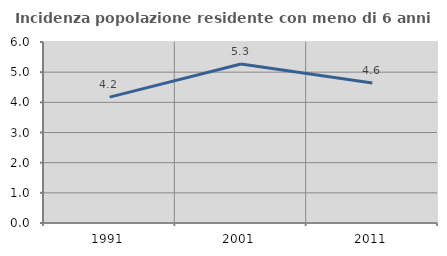
| Category | Incidenza popolazione residente con meno di 6 anni |
|---|---|
| 1991.0 | 4.172 |
| 2001.0 | 5.27 |
| 2011.0 | 4.64 |